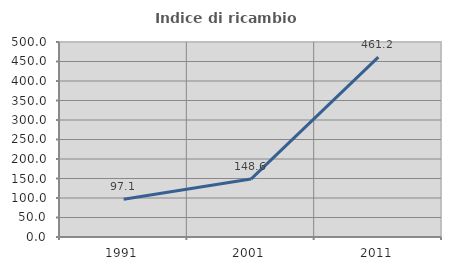
| Category | Indice di ricambio occupazionale  |
|---|---|
| 1991.0 | 97.059 |
| 2001.0 | 148.611 |
| 2011.0 | 461.194 |